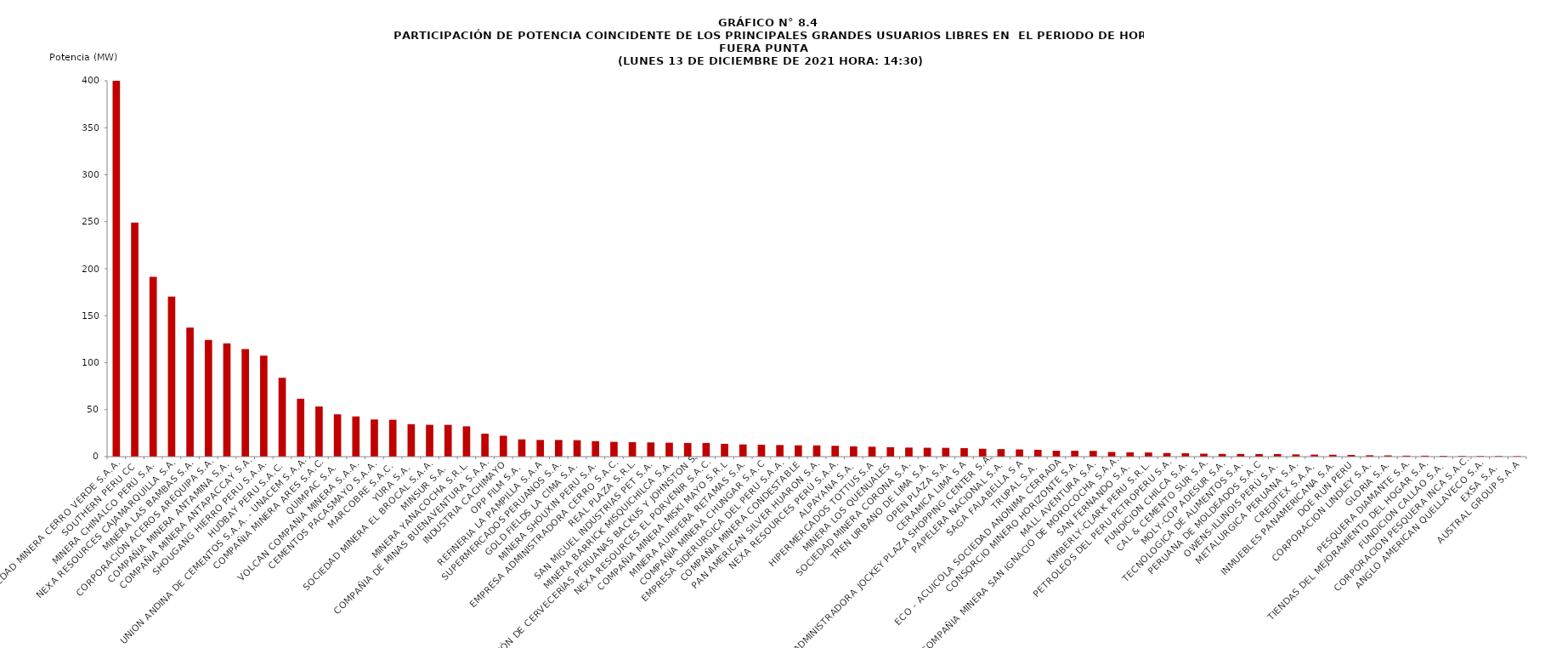
| Category | Series 0 |
|---|---|
| SOCIEDAD MINERA CERRO VERDE S.A.A. | 429.85 |
| SOUTHERN PERU CC | 249.17 |
| MINERA CHINALCO PERÚ S.A. | 191.3 |
| NEXA RESOURCES CAJAMARQUILLA S.A. | 170.29 |
| MINERA LAS BAMBAS S.A. | 137.31 |
| CORPORACIÓN ACEROS AREQUIPA S.A. | 124.23 |
| COMPAÑIA MINERA ANTAMINA S.A. | 120.56 |
| COMPAÑIA MINERA ANTAPACCAY S.A. | 114.44 |
| SHOUGANG HIERRO PERU S.A.A. | 107.5 |
| HUDBAY PERU S.A.C. | 84.04 |
| UNION ANDINA DE CEMENTOS S.A.A. - UNACEM S.A.A. | 61.65 |
| COMPAÑIA MINERA ARES S.A.C. | 53.37 |
| QUIMPAC S.A. | 45.05 |
| VOLCAN COMPANIA MINERA S.A.A. | 42.8 |
| CEMENTOS PACASMAYO S.A.A. | 39.57 |
| MARCOBRE S.A.C. | 39.27 |
| YURA S.A. | 34.59 |
| SOCIEDAD MINERA EL BROCAL S.A.A. | 33.91 |
| MINSUR S.A. | 33.86 |
| MINERA YANACOCHA S.R.L. | 32.26 |
| COMPAÑIA DE MINAS BUENAVENTURA S.A.A. | 24.49 |
| INDUSTRIA CACHIMAYO | 22.27 |
| OPP FILM S.A. | 18.39 |
| REFINERIA LA PAMPILLA S.A.A | 17.77 |
| SUPERMERCADOS PERUANOS S.A. | 17.76 |
| GOLD FIELDS LA CIMA S.A. | 17.51 |
| MINERA SHOUXIN PERU S.A. | 16.52 |
| EMPRESA ADMINISTRADORA CERRO S.A.C. | 15.78 |
| REAL PLAZA S.R.L. | 15.37 |
| SAN MIGUEL INDUSTRIAS PET S.A. | 15.15 |
| MINERA BARRICK MISQUICHILCA S.A. | 14.84 |
| UNIÓN DE CERVECERÍAS PERUANAS BACKUS Y JOHNSTON S. | 14.59 |
| NEXA RESOURCES EL PORVENIR S.A.C. | 14.56 |
| COMPAÑIA MINERA MISKI MAYO S.R.L | 13.65 |
| MINERA AURIFERA RETAMAS S.A. | 13.02 |
| COMPAÑÍA MINERA CHUNGAR S.A.C | 12.71 |
| EMPRESA SIDERURGICA DEL PERU S.A.A. | 12.35 |
| COMPAÑIA MINERA CONDESTABLE | 12.04 |
| PAN AMERICAN SILVER HUARON S.A. | 11.98 |
| NEXA RESOURCES PERÚ S.A.A. | 11.56 |
| ALPAYANA S.A. | 10.96 |
| HIPERMERCADOS TOTTUS S.A | 10.55 |
| MINERA LOS QUENUALES | 10.09 |
| SOCIEDAD MINERA CORONA S.A. | 9.65 |
| TREN URBANO DE LIMA S.A. | 9.46 |
| OPEN PLAZA S.A. | 9.39 |
| CERAMICA LIMA S A | 9.12 |
| ADMINISTRADORA JOCKEY PLAZA SHOPPING CENTER S.A. | 8.38 |
| PAPELERA NACIONAL S.A. | 8.02 |
| SAGA FALABELLA S A | 7.65 |
| TRUPAL S.A. | 7.29 |
| ECO - ACUICOLA SOCIEDAD ANONIMA CERRADA | 6.32 |
| CONSORCIO MINERO HORIZONTE S.A. | 6.3 |
| MALL AVENTURA S.A. | 6.14 |
| COMPAÑIA MINERA SAN IGNACIO DE MOROCOCHA S.A.A. | 4.96 |
| SAN FERNANDO S.A. | 4.63 |
| KIMBERLY-CLARK PERU S.R.L. | 4.44 |
| PETROLEOS DEL PERU PETROPERU S.A. | 3.87 |
| FUNDICION CHILCA S.A. | 3.62 |
| CAL & CEMENTO SUR S.A. | 3.17 |
| MOLY-COP ADESUR S.A. | 2.91 |
| TECNOLOGICA DE ALIMENTOS S.A. | 2.88 |
| PERUANA DE MOLDEADOS S.A.C | 2.8 |
| OWENS-ILLINOIS PERÚ S.A. | 2.78 |
| METALURGICA PERUANA S.A. | 2.42 |
| CREDITEX S.A.A. | 2.18 |
| INMUEBLES PANAMERICANA S.A. | 2.04 |
| DOE RUN PERU | 1.85 |
| CORPORACION LINDLEY S.A. | 1.53 |
| GLORIA S.A. | 1.36 |
| PESQUERA DIAMANTE S.A. | 1.09 |
| TIENDAS DEL MEJORAMIENTO DEL HOGAR S.A. | 1.05 |
| FUNDICION CALLAO S.A. | 0.91 |
| CORPORACION PESQUERA INCA S.A.C. | 0.74 |
| ANGLO AMERICAN QUELLAVECO S.A. | 0.66 |
| EXSA S.A. | 0.65 |
| AUSTRAL GROUP S.A.A | 0.57 |